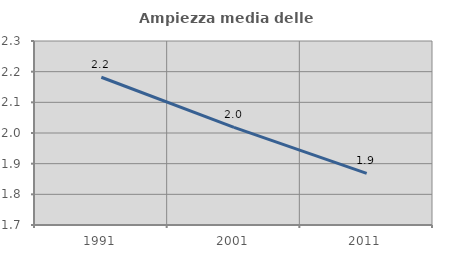
| Category | Ampiezza media delle famiglie |
|---|---|
| 1991.0 | 2.182 |
| 2001.0 | 2.018 |
| 2011.0 | 1.868 |